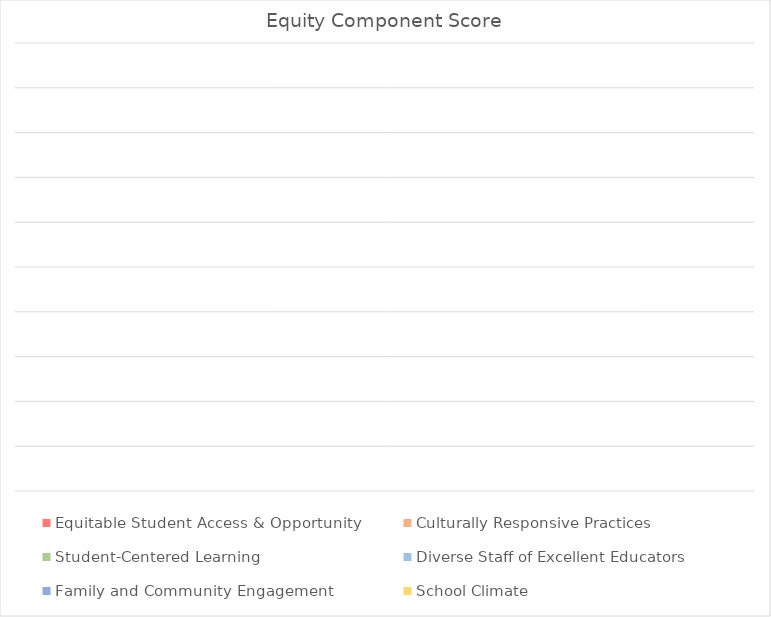
| Category | Equitable Student Access & Opportunity | Culturally Responsive Practices | Student-Centered Learning | Diverse Staff of Excellent Educators | Family and Community Engagement | School Climate |
|---|---|---|---|---|---|---|
| 0 | 0 | 0 | 0 | 0 | 0 | 0 |